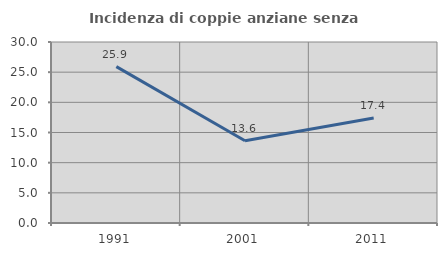
| Category | Incidenza di coppie anziane senza figli  |
|---|---|
| 1991.0 | 25.926 |
| 2001.0 | 13.636 |
| 2011.0 | 17.391 |